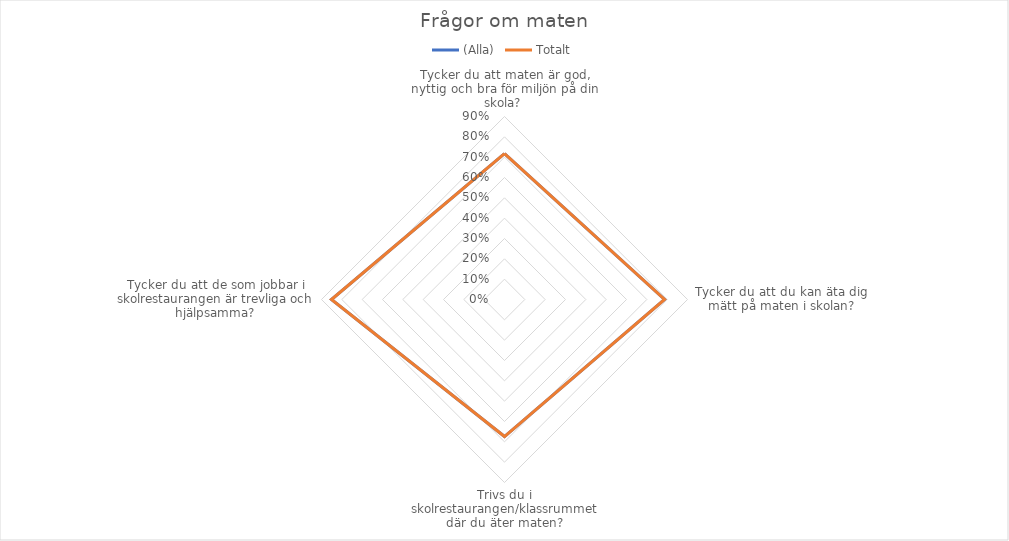
| Category | (Alla) | Totalt |
|---|---|---|
| Tycker du att maten är god, nyttig och bra för miljön på din skola?  | 0.717 | 0.717 |
| Tycker du att du kan äta dig mätt på maten i skolan? | 0.787 | 0.787 |
| Trivs du i skolrestaurangen/klassrummet där du äter maten? | 0.674 | 0.674 |
| Tycker du att de som jobbar i skolrestaurangen är trevliga och hjälpsamma? | 0.851 | 0.851 |